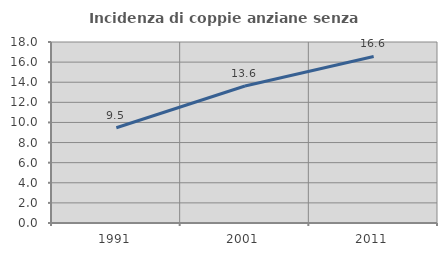
| Category | Incidenza di coppie anziane senza figli  |
|---|---|
| 1991.0 | 9.467 |
| 2001.0 | 13.623 |
| 2011.0 | 16.561 |